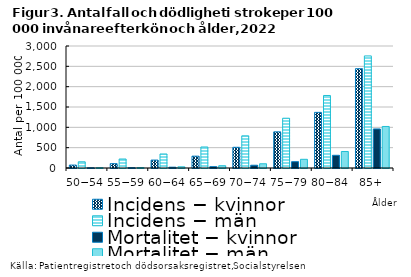
| Category | Incidens − kvinnor | Incidens − män | Mortalitet − kvinnor | Mortalitet − män |
|---|---|---|---|---|
| 50−54 | 72 | 153 | 5 | 8 |
| 55−59 | 107 | 221 | 8 | 11 |
| 60−64 | 195 | 345 | 20 | 29 |
| 65−69 | 291 | 517 | 33 | 56 |
| 70−74 | 509 | 791 | 68 | 104 |
| 75−79 | 889 | 1224 | 155 | 214 |
| 80−84 | 1368 | 1783 | 312 | 406 |
| 85+ | 2442 | 2756 | 960 | 1021 |